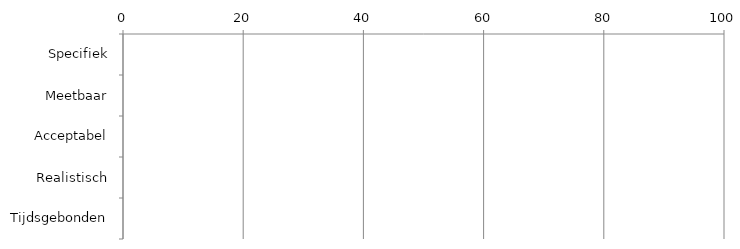
| Category | Series 0 |
|---|---|
| Specifiek | 0 |
| Meetbaar | 0 |
| Acceptabel | 0 |
| Realistisch | 0 |
| Tijdsgebonden | 0 |